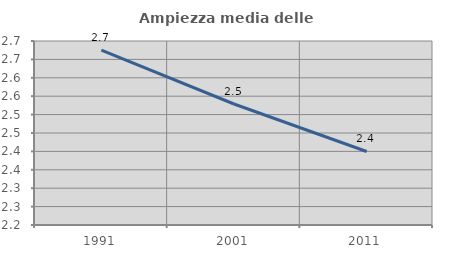
| Category | Ampiezza media delle famiglie |
|---|---|
| 1991.0 | 2.675 |
| 2001.0 | 2.529 |
| 2011.0 | 2.4 |